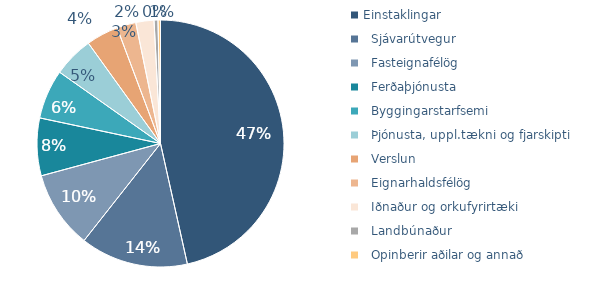
| Category | Series 0 |
|---|---|
| Einstaklingar | 592216 |
|   Sjávarútvegur | 179713 |
|   Fasteignafélög | 129462 |
|   Ferðaþjónusta | 95996 |
|   Byggingarstarfsemi | 82345 |
|   Þjónusta, uppl.tækni og fjarskipti | 67352 |
|   Verslun | 53590 |
|   Eignarhaldsfélög | 31849 |
|   Iðnaður og orkufyrirtæki | 30231 |
|   Landbúnaður | 6544 |
|   Opinberir aðilar og annað | 4128 |